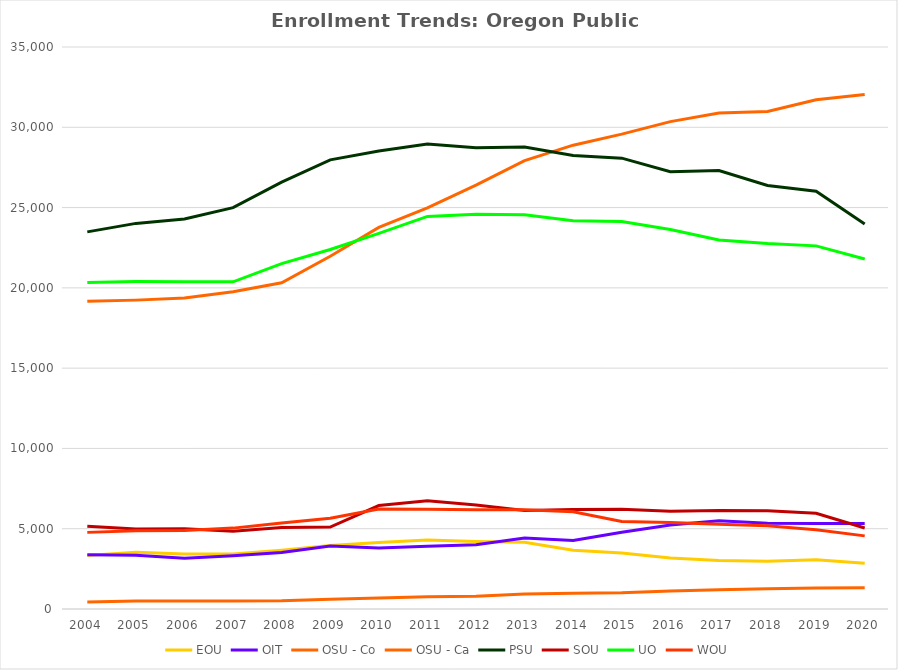
| Category | EOU | OIT | OSU - Co | OSU - Ca | PSU | SOU | UO | WOU |
|---|---|---|---|---|---|---|---|---|
| 2004.0 | 3338 | 3373 | 19159 | 438 | 23486 | 5161 | 20339 | 4772 |
| 2005.0 | 3533 | 3351 | 19236 | 491 | 24015 | 4989 | 20394 | 4879 |
| 2006.0 | 3425 | 3157 | 19362 | 495 | 24284 | 5002 | 20388 | 4889 |
| 2007.0 | 3433 | 3318 | 19753 | 497 | 24999 | 4836 | 20376 | 5037 |
| 2008.0 | 3666 | 3525 | 20320 | 510 | 26587 | 5082 | 21507 | 5349 |
| 2009.0 | 3957 | 3927 | 21969 | 611 | 27972 | 5104 | 22386 | 5654 |
| 2010.0 | 4137 | 3797 | 23761 | 678 | 28522 | 6443 | 23389 | 6233 |
| 2011.0 | 4298 | 3911 | 24977 | 764 | 28958 | 6744 | 24447 | 6217 |
| 2012.0 | 4208 | 4001 | 26393 | 801 | 28731 | 6481 | 24591 | 6187 |
| 2013.0 | 4157 | 4414 | 27925 | 936 | 28766 | 6140 | 24548 | 6188 |
| 2014.0 | 3653 | 4273 | 28886 | 980 | 28241 | 6203 | 24181 | 6058 |
| 2015.0 | 3488 | 4786 | 29576 | 1016 | 28076 | 6215 | 24125 | 5445 |
| 2016.0 | 3176 | 5232 | 30354 | 1122 | 27229 | 6088 | 23634 | 5382 |
| 2017.0 | 3016 | 5490 | 30896 | 1204 | 27305 | 6139 | 22980 | 5285 |
| 2018.0 | 2978 | 5341 | 30986 | 1259 | 26379 | 6119 | 22760 | 5185 |
| 2019.0 | 3067 | 5319 | 31719 | 1311 | 26020 | 5966 | 22615 | 4929 |
| 2020.0 | 2853 | 5325 | 32034.942 | 1324.058 | 23979 | 5041 | 21800 | 4554 |